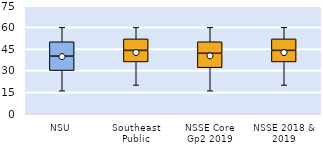
| Category | 25th | 50th | 75th |
|---|---|---|---|
| NSU | 30 | 10 | 10 |
| Southeast Public | 36 | 8 | 8 |
| NSSE Core Gp2 2019 | 32 | 10 | 8 |
| NSSE 2018 & 2019 | 36 | 8 | 8 |